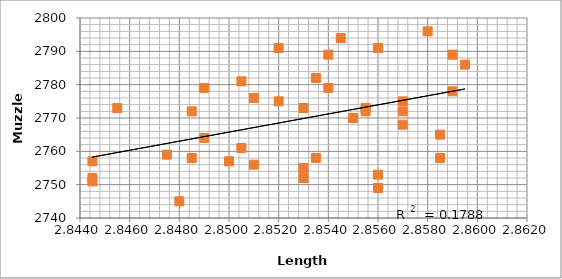
| Category | gb  |
|---|---|
| 2.854 | 2779 |
| 2.85 | 2756 |
| 2.853 | 2749 |
| 2.849 | 2752 |
| 2.8555 | 2758 |
| 2.845 | 2779 |
| 2.8545 | 2776 |
| 2.858 | 2761 |
| 2.8525 | 2758 |
| 2.848 | 2789 |
| 2.856 | 2775 |
| 2.8475 | 2781 |
| 2.851 | 2753 |
| 2.8455 | 2751 |
| 2.8555 | 2759 |
| 2.86 | 2757 |
| 2.849 | 2789 |
| 2.848 | 2796 |
| 2.8485 | 2755 |
| 2.8535 | 2794 |
| 2.851 | 2758 |
| 2.8535 | 2786 |
| 2.857 | 2757 |
| 2.851 | 2773 |
| 2.854 | 2764 |
| 2.851 | 2752 |
| 2.8455 | 2782 |
| 2.85 | 2768 |
| 2.8535 | 2778 |
| 2.8475 | 2770 |
| 2.8495 | 2775 |
| 2.846 | 2745 |
| 2.85 | 2773 |
| 2.855 | 2772 |
| 2.8575 | 2772 |
| 2.848 | 2791 |
| 2.8475 | 2772 |
| 2.853 | 2791 |
| 2.859 | 2765 |
| 2.847 | 2773 |